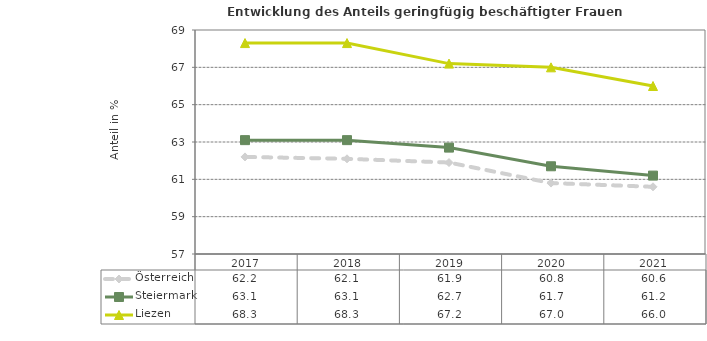
| Category | Österreich | Steiermark | Liezen |
|---|---|---|---|
| 2021.0 | 60.6 | 61.2 | 66 |
| 2020.0 | 60.8 | 61.7 | 67 |
| 2019.0 | 61.9 | 62.7 | 67.2 |
| 2018.0 | 62.1 | 63.1 | 68.3 |
| 2017.0 | 62.2 | 63.1 | 68.3 |